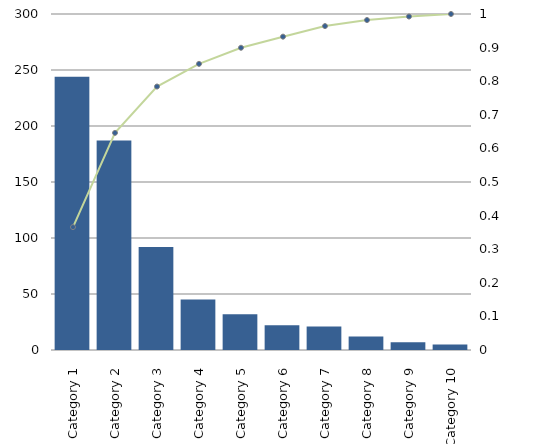
| Category | Series 1 |
|---|---|
| Category 1 | 244 |
| Category 2 | 187 |
| Category 3 | 92 |
| Category 4 | 45 |
| Category 5 | 32 |
| Category 6 | 22 |
| Category 7 | 21 |
| Category 8 | 12 |
| Category 9 | 7 |
| Category 10 | 5 |